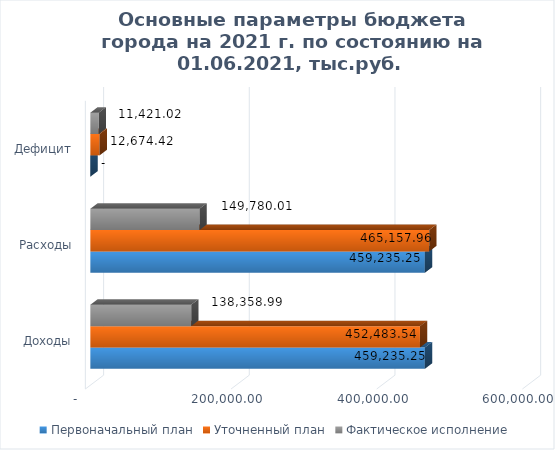
| Category | Первоначальный план | Уточненный план | Фактическое исполнение |
|---|---|---|---|
| Доходы | 459235.253 | 452483.539 | 138358.99 |
| Расходы | 459235.253 | 465157.961 | 149780.007 |
| Дефицит | 0 | 12674.422 | 11421.016 |